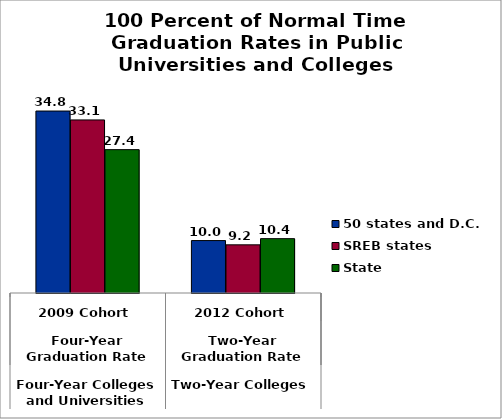
| Category | 50 states and D.C. | SREB states | State |
|---|---|---|---|
| 0 | 34.826 | 33.123 | 27.44 |
| 1 | 10.033 | 9.218 | 10.402 |